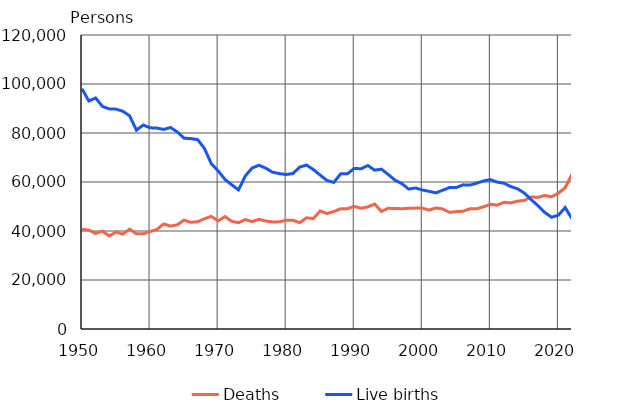
| Category | Deaths | Live births |
|---|---|---|
| 1950 | 40681 | 98065 |
| 1951 | 40386 | 93063 |
| 1952 | 39024 | 94314 |
| 1953 | 39925 | 90866 |
| 1954 | 37988 | 89845 |
| 1955 | 39573 | 89740 |
| 1956 | 38713 | 88896 |
| 1957 | 40741 | 86985 |
| 1958 | 38833 | 81148 |
| 1959 | 38827 | 83253 |
| 1960 | 39797 | 82129 |
| 1961 | 40616 | 81996 |
| 1962 | 42889 | 81454 |
| 1963 | 42010 | 82251 |
| 1964 | 42512 | 80428 |
| 1965 | 44473 | 77885 |
| 1966 | 43548 | 77697 |
| 1967 | 43790 | 77289 |
| 1968 | 45013 | 73654 |
| 1969 | 45966 | 67450 |
| 1970 | 44119 | 64559 |
| 1971 | 45876 | 61067 |
| 1972 | 43958 | 58864 |
| 1973 | 43410 | 56787 |
| 1974 | 44676 | 62472 |
| 1975 | 43828 | 65719 |
| 1976 | 44786 | 66846 |
| 1977 | 44065 | 65659 |
| 1978 | 43692 | 63983 |
| 1979 | 43738 | 63428 |
| 1980 | 44398 | 63064 |
| 1981 | 44404 | 63469 |
| 1982 | 43408 | 66106 |
| 1983 | 45388 | 66892 |
| 1984 | 45098 | 65076 |
| 1985 | 48198 | 62796 |
| 1986 | 47135 | 60632 |
| 1987 | 47949 | 59827 |
| 1988 | 49063 | 63316 |
| 1989 | 49110 | 63348 |
| 1990 | 50058 | 65549 |
| 1991 | 49294 | 65395 |
| 1992 | 49844 | 66731 |
| 1993 | 50988 | 64826 |
| 1994 | 48000 | 65231 |
| 1995 | 49280 | 63067 |
| 1996 | 49167 | 60723 |
| 1997 | 49108 | 59329 |
| 1998 | 49262 | 57108 |
| 1999 | 49345 | 57574 |
| 2000 | 49339 | 56742 |
| 2001 | 48550 | 56189 |
| 2002 | 49418 | 55555 |
| 2003 | 48996 | 56630 |
| 2004 | 47600 | 57758 |
| 2005 | 47928 | 57745 |
| 2006 | 48065 | 58840 |
| 2007 | 49077 | 58729 |
| 2008 | 49094 | 59530 |
| 2009 | 49883 | 60430 |
| 2010 | 50887 | 60980 |
| 2011 | 50585 | 59961 |
| 2012 | 51707 | 59493 |
| 2013 | 51472 | 58134 |
| 2014 | 52186 | 57232 |
| 2015 | 52492 | 55472 |
| 2016 | 53923 | 52814 |
| 2017 | 53722 | 50321 |
| 2018 | 54527 | 47577 |
| 2019 | 53949 | 45613 |
| 2020 | 55488 | 46463 |
| 2021 | 57659 | 49594 |
| 2022 | 63219 | 44951 |